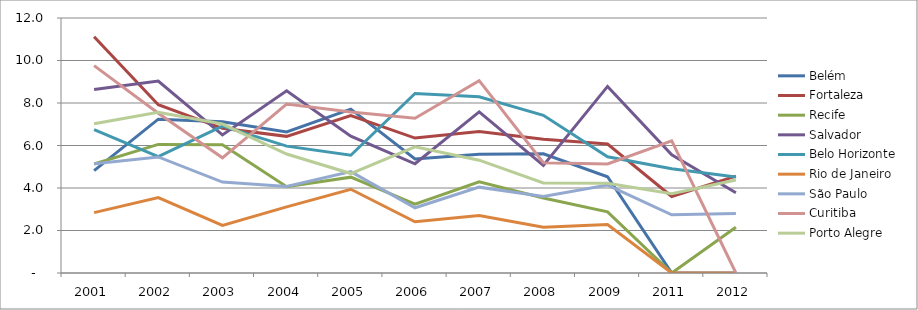
| Category | Belém | Fortaleza | Recife | Salvador | Belo Horizonte | Rio de Janeiro | São Paulo | Curitiba | Porto Alegre |
|---|---|---|---|---|---|---|---|---|---|
| 2001.0 | 4.82 | 11.12 | 5.13 | 8.64 | 6.75 | 2.84 | 5.14 | 9.76 | 7.02 |
| 2002.0 | 7.24 | 7.92 | 6.05 | 9.03 | 5.48 | 3.55 | 5.46 | 7.52 | 7.56 |
| 2003.0 | 7.12 | 6.81 | 6.04 | 6.5 | 6.91 | 2.24 | 4.28 | 5.42 | 7.01 |
| 2004.0 | 6.64 | 6.43 | 4.06 | 8.57 | 5.97 | 3.11 | 4.07 | 7.95 | 5.6 |
| 2005.0 | 7.71 | 7.41 | 4.51 | 6.44 | 5.54 | 3.94 | 4.77 | 7.58 | 4.68 |
| 2006.0 | 5.37 | 6.35 | 3.24 | 5.14 | 8.45 | 2.41 | 3.07 | 7.28 | 5.94 |
| 2007.0 | 5.59 | 6.66 | 4.29 | 7.58 | 8.29 | 2.71 | 4.04 | 9.05 | 5.31 |
| 2008.0 | 5.61 | 6.29 | 3.53 | 5.06 | 7.42 | 2.15 | 3.6 | 5.19 | 4.24 |
| 2009.0 | 4.53 | 6.07 | 2.88 | 8.78 | 5.47 | 2.28 | 4.14 | 5.13 | 4.22 |
| 2011.0 | 0 | 3.6 | 0 | 5.56 | 4.91 | 0 | 2.74 | 6.22 | 3.73 |
| 2012.0 | 0 | 4.56 | 2.15 | 3.78 | 4.52 | 0 | 2.8 | 0 | 4.38 |